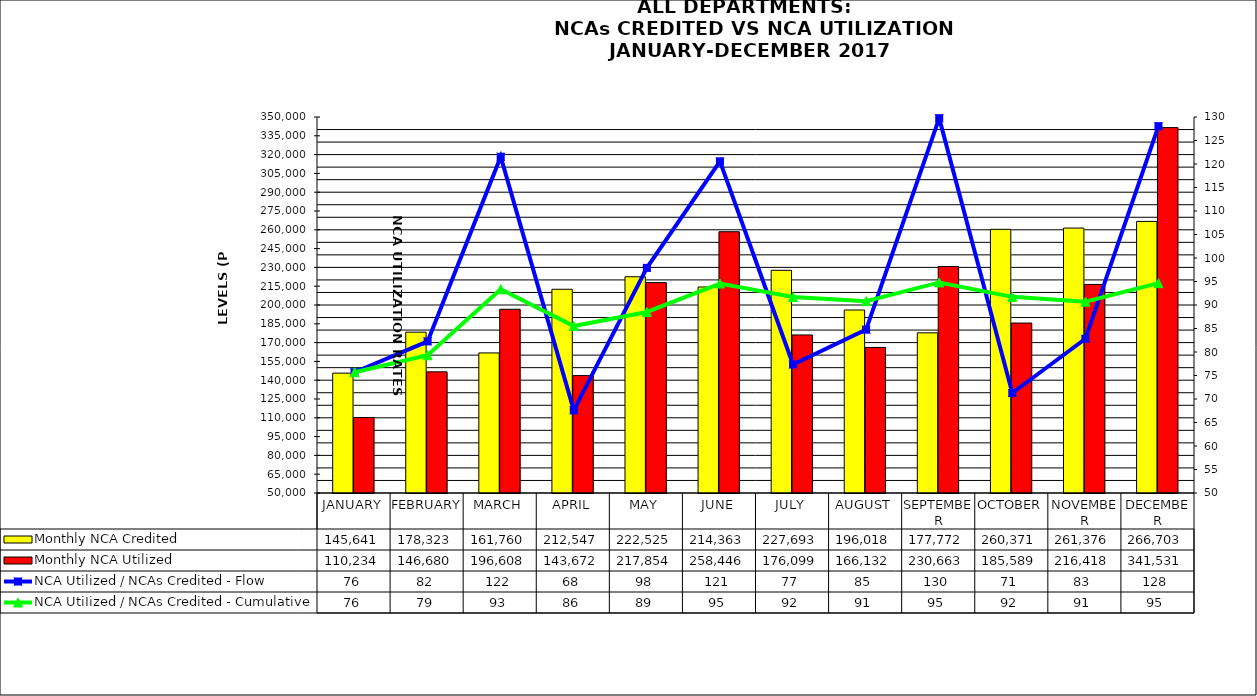
| Category | Monthly NCA Credited | Monthly NCA Utilized |
|---|---|---|
| JANUARY | 145641.21 | 110233.746 |
| FEBRUARY | 178323.305 | 146679.629 |
| MARCH | 161759.977 | 196607.535 |
| APRIL | 212547.009 | 143672.312 |
| MAY | 222525.052 | 217854.449 |
| JUNE | 214363.27 | 258445.599 |
| JULY | 227693.245 | 176099.233 |
| AUGUST | 196017.931 | 166131.832 |
| SEPTEMBER | 177772.488 | 230662.846 |
| OCTOBER | 260371.234 | 185588.8 |
| NOVEMBER | 261376.289 | 216418.145 |
| DECEMBER | 266703.138 | 341531.029 |